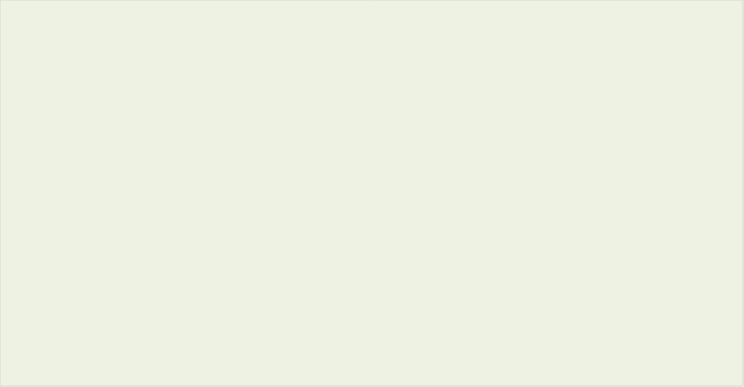
| Category | Series 0 |
|---|---|
| Dimensions showing poor level of readiness  | 0 |
| Dimensions showing a moderate  level of readiness | 0 |
| Dimensions showing a strong level of readiness  | 0 |
| Dimension not applicable | 0 |